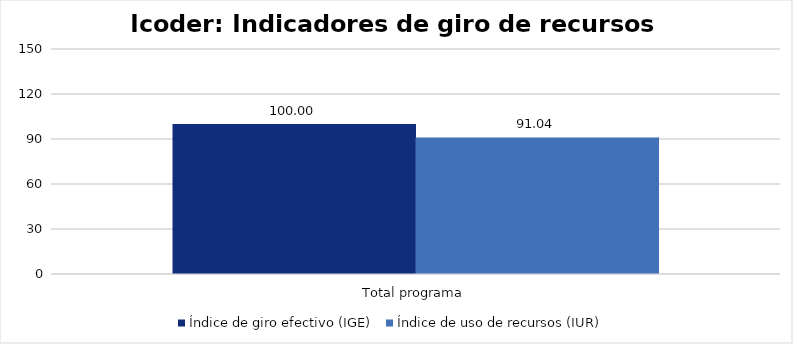
| Category | Índice de giro efectivo (IGE) | Índice de uso de recursos (IUR)  |
|---|---|---|
| Total programa | 100 | 91.042 |